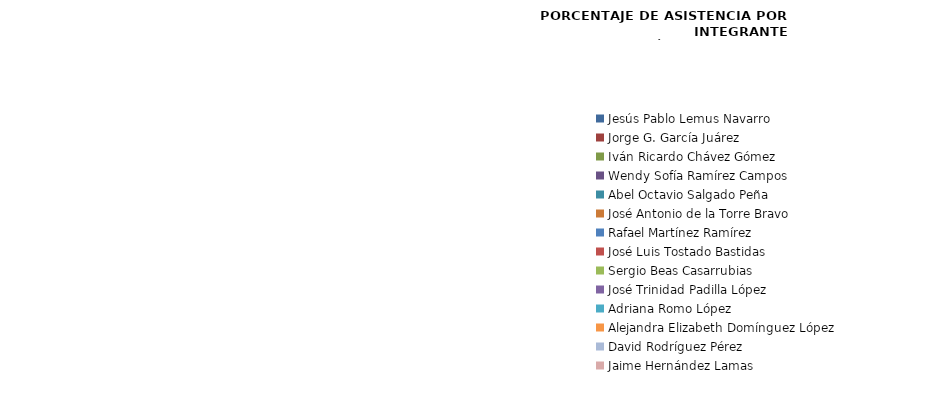
| Category | Series 0 |
|---|---|
| Jesús Pablo Lemus Navarro | 0 |
| Jorge G. García Juárez | 0 |
| Iván Ricardo Chávez Gómez | 0 |
| Wendy Sofía Ramírez Campos | 0 |
| Abel Octavio Salgado Peña | 0 |
| José Antonio de la Torre Bravo | 0 |
| Rafael Martínez Ramírez | 0 |
| José Luis Tostado Bastidas | 0 |
| Sergio Beas Casarrubias | 0 |
| José Trinidad Padilla López | 0 |
| Adriana Romo López | 0 |
| Alejandra Elizabeth Domínguez López | 0 |
| David Rodríguez Pérez | 0 |
| Jaime Hernández Lamas | 0 |